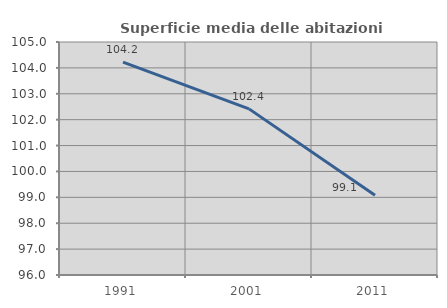
| Category | Superficie media delle abitazioni occupate |
|---|---|
| 1991.0 | 104.225 |
| 2001.0 | 102.417 |
| 2011.0 | 99.077 |